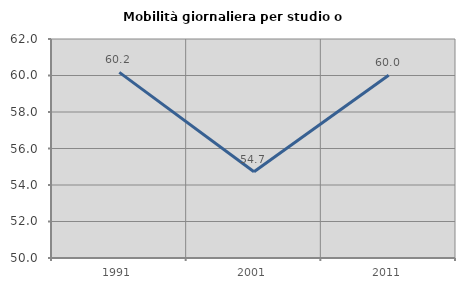
| Category | Mobilità giornaliera per studio o lavoro |
|---|---|
| 1991.0 | 60.174 |
| 2001.0 | 54.722 |
| 2011.0 | 60.016 |